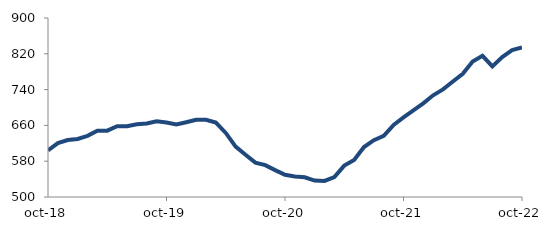
| Category | Series 0 |
|---|---|
| 2018-10-01 | 604.2 |
| 2018-11-01 | 620.436 |
| 2018-12-01 | 627.396 |
| 2019-01-01 | 629.794 |
| 2019-02-01 | 636.624 |
| 2019-03-01 | 648.17 |
| 2019-04-01 | 648.206 |
| 2019-05-01 | 658.035 |
| 2019-06-01 | 657.952 |
| 2019-07-01 | 662.49 |
| 2019-08-01 | 664.104 |
| 2019-09-01 | 669.196 |
| 2019-10-01 | 666.5 |
| 2019-11-01 | 662.174 |
| 2019-12-01 | 667.143 |
| 2020-01-01 | 672.455 |
| 2020-02-01 | 672.659 |
| 2020-03-01 | 666.213 |
| 2020-04-01 | 643.145 |
| 2020-05-01 | 612.572 |
| 2020-06-01 | 594.292 |
| 2020-07-01 | 576.858 |
| 2020-08-01 | 571.224 |
| 2020-09-01 | 560.032 |
| 2020-10-01 | 549.541 |
| 2020-11-01 | 545.982 |
| 2020-12-01 | 544.038 |
| 2021-01-01 | 536.772 |
| 2021-02-01 | 535.938 |
| 2021-03-01 | 544.717 |
| 2021-04-01 | 570.16 |
| 2021-05-01 | 582.981 |
| 2021-06-01 | 611.684 |
| 2021-07-01 | 627.037 |
| 2021-08-01 | 636.642 |
| 2021-09-01 | 661.114 |
| 2021-10-01 | 677.889 |
| 2021-11-01 | 693.389 |
| 2021-12-01 | 709.343 |
| 2022-01-01 | 727.31 |
| 2022-02-01 | 740.539 |
| 2022-03-01 | 758.027 |
| 2022-04-01 | 775.241 |
| 2022-05-01 | 802.956 |
| 2022-06-01 | 815.434 |
| 2022-07-01 | 791.89 |
| 2022-08-01 | 812.76 |
| 2022-09-01 | 828.12 |
| 2022-10-01 | 834 |